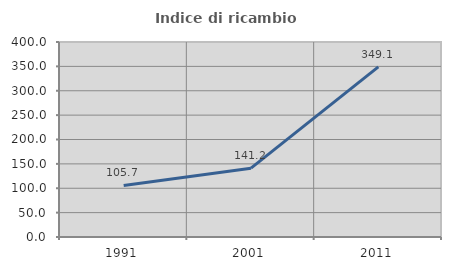
| Category | Indice di ricambio occupazionale  |
|---|---|
| 1991.0 | 105.66 |
| 2001.0 | 141.176 |
| 2011.0 | 349.057 |